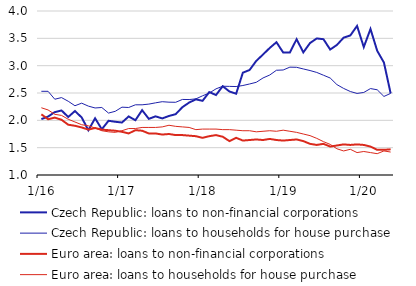
| Category | Czech Republic: loans to non-financial corporations | Czech Republic: loans to households for house purchase | Euro area: loans to non-financial corporations | Euro area: loans to households for house purchase |
|---|---|---|---|---|
|  1/16 | 2.022 | 2.531 | 2.11 | 2.23 |
| 2 | 2.069 | 2.531 | 2.02 | 2.19 |
| 3 | 2.15 | 2.386 | 2.05 | 2.11 |
| 4 | 2.181 | 2.416 | 2.01 | 2.09 |
| 5 | 2.061 | 2.349 | 1.92 | 2.02 |
| 6 | 2.17 | 2.267 | 1.9 | 1.97 |
| 7 | 2.053 | 2.314 | 1.87 | 1.92 |
| 8 | 1.819 | 2.26 | 1.83 | 1.9 |
| 9 | 2.037 | 2.226 | 1.86 | 1.86 |
| 10 | 1.837 | 2.235 | 1.83 | 1.81 |
| 11 | 1.992 | 2.133 | 1.82 | 1.79 |
| 12 | 1.974 | 2.165 | 1.81 | 1.78 |
|  1/17 | 1.96 | 2.241 | 1.79 | 1.81 |
| 2 | 2.071 | 2.235 | 1.76 | 1.85 |
| 3 | 2.002 | 2.284 | 1.82 | 1.85 |
| 4 | 2.186 | 2.284 | 1.81 | 1.87 |
| 5 | 2.027 | 2.297 | 1.76 | 1.87 |
| 6 | 2.073 | 2.32 | 1.76 | 1.87 |
| 7 | 2.035 | 2.341 | 1.74 | 1.88 |
| 8 | 2.08 | 2.332 | 1.75 | 1.91 |
| 9 | 2.113 | 2.33 | 1.73 | 1.89 |
| 10 | 2.241 | 2.382 | 1.73 | 1.88 |
| 11 | 2.325 | 2.38 | 1.72 | 1.87 |
| 12 | 2.384 | 2.392 | 1.71 | 1.83 |
|  1/18 | 2.357 | 2.449 | 1.68 | 1.84 |
| 2 | 2.517 | 2.499 | 1.71 | 1.84 |
| 3 | 2.463 | 2.576 | 1.73 | 1.84 |
| 4 | 2.624 | 2.624 | 1.7 | 1.83 |
| 5 | 2.528 | 2.621 | 1.62 | 1.83 |
| 6 | 2.487 | 2.618 | 1.68 | 1.82 |
| 7 | 2.872 | 2.637 | 1.63 | 1.81 |
| 8 | 2.921 | 2.665 | 1.64 | 1.81 |
| 9 | 3.088 | 2.696 | 1.65 | 1.79 |
| 10 | 3.204 | 2.775 | 1.64 | 1.8 |
| 11 | 3.324 | 2.829 | 1.66 | 1.81 |
| 12 | 3.429 | 2.916 | 1.64 | 1.8 |
|  1/19 | 3.241 | 2.921 | 1.63 | 1.82 |
| 2 | 3.241 | 2.973 | 1.64 | 1.8 |
| 3 | 3.484 | 2.97 | 1.65 | 1.78 |
| 4 | 3.243 | 2.94 | 1.62 | 1.75 |
| 5 | 3.414 | 2.911 | 1.57 | 1.72 |
| 6 | 3.498 | 2.876 | 1.55 | 1.67 |
| 7 | 3.484 | 2.825 | 1.57 | 1.61 |
| 8 | 3.295 | 2.774 | 1.52 | 1.56 |
| 9 | 3.379 | 2.654 | 1.54 | 1.48 |
| 10 | 3.512 | 2.584 | 1.56 | 1.44 |
| 11 | 3.553 | 2.527 | 1.55 | 1.47 |
| 12 | 3.727 | 2.492 | 1.56 | 1.41 |
|  1/20 | 3.34 | 2.51 | 1.55 | 1.43 |
| 2 | 3.671 | 2.581 | 1.52 | 1.41 |
| 3 | 3.272 | 2.559 | 1.46 | 1.39 |
| 4 | 3.057 | 2.437 | 1.46 | 1.44 |
| 5 | 2.493 | 2.493 | 1.47 | 1.42 |